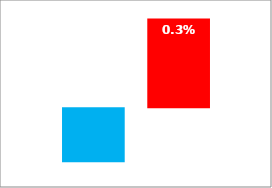
| Category | Dem | Rep |
|---|---|---|
| 0 | -0.002 | 0.003 |